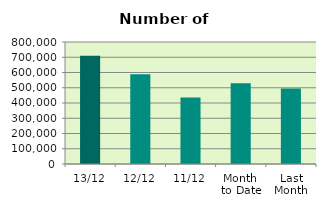
| Category | Series 0 |
|---|---|
| 13/12 | 710586 |
| 12/12 | 589124 |
| 11/12 | 436800 |
| Month 
to Date | 529458 |
| Last
Month | 495852.095 |